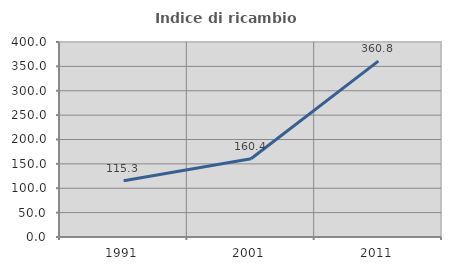
| Category | Indice di ricambio occupazionale  |
|---|---|
| 1991.0 | 115.289 |
| 2001.0 | 160.413 |
| 2011.0 | 360.849 |